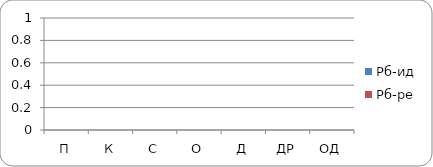
| Category | Рб-ид | Рб-ре |
|---|---|---|
| П | 0 | 0 |
| К | 0 | 0 |
| С | 0 | 0 |
| О | 0 | 0 |
| Д | 0 | 0 |
| ДР | 0 | 0 |
| ОД | 0 | 0 |